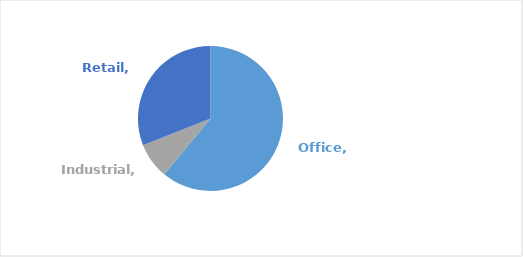
| Category | Series 0 |
|---|---|
| Office | 0.61 |
| Industrial | 0.08 |
| Retail | 0.31 |